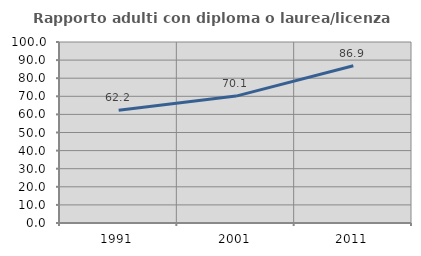
| Category | Rapporto adulti con diploma o laurea/licenza media  |
|---|---|
| 1991.0 | 62.232 |
| 2001.0 | 70.105 |
| 2011.0 | 86.872 |